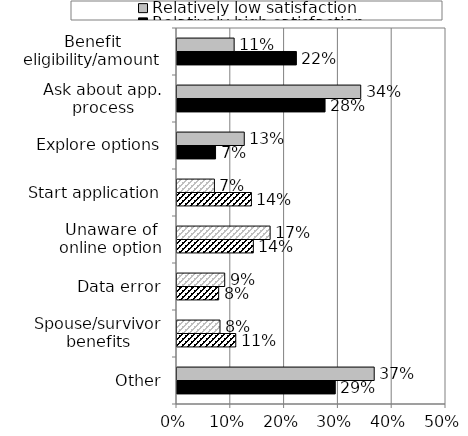
| Category | Relatively high satisfaction | Relatively low satisfaction |
|---|---|---|
| Other | 0.294 | 0.367 |
| Spouse/survivor benefits | 0.109 | 0.08 |
| Data error | 0.077 | 0.089 |
| Unaware of online option | 0.142 | 0.173 |
| Start application | 0.138 | 0.07 |
| Explore options | 0.072 | 0.125 |
| Ask about app. process | 0.275 | 0.342 |
| Benefit eligibility/amount | 0.222 | 0.106 |